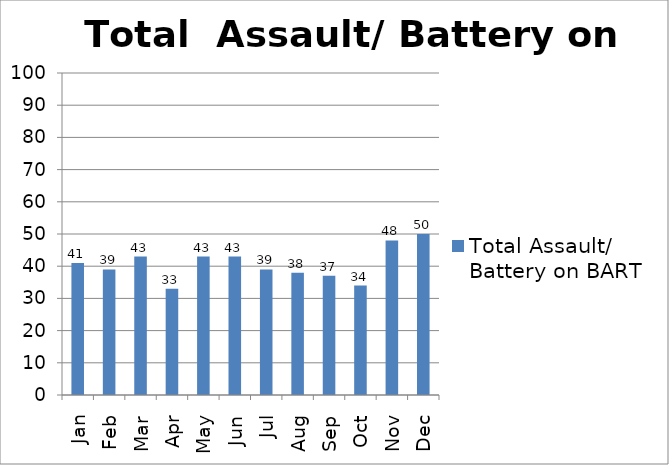
| Category | Total Assault/ Battery on BART |
|---|---|
| Jan | 41 |
| Feb | 39 |
| Mar | 43 |
| Apr | 33 |
| May | 43 |
| Jun | 43 |
| Jul | 39 |
| Aug | 38 |
| Sep | 37 |
| Oct | 34 |
| Nov | 48 |
| Dec | 50 |